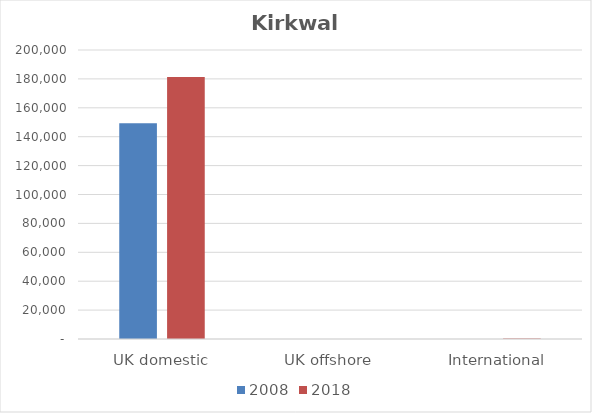
| Category | 2008 | 2018 |
|---|---|---|
| UK domestic | 149272 | 181260 |
| UK offshore | 4 | 19 |
| International | 86 | 410 |